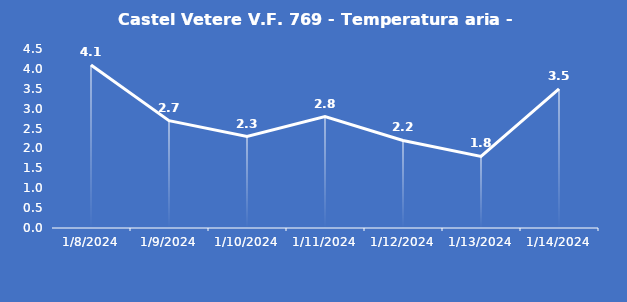
| Category | Castel Vetere V.F. 769 - Temperatura aria - Grezzo (°C) |
|---|---|
| 1/8/24 | 4.1 |
| 1/9/24 | 2.7 |
| 1/10/24 | 2.3 |
| 1/11/24 | 2.8 |
| 1/12/24 | 2.2 |
| 1/13/24 | 1.8 |
| 1/14/24 | 3.5 |